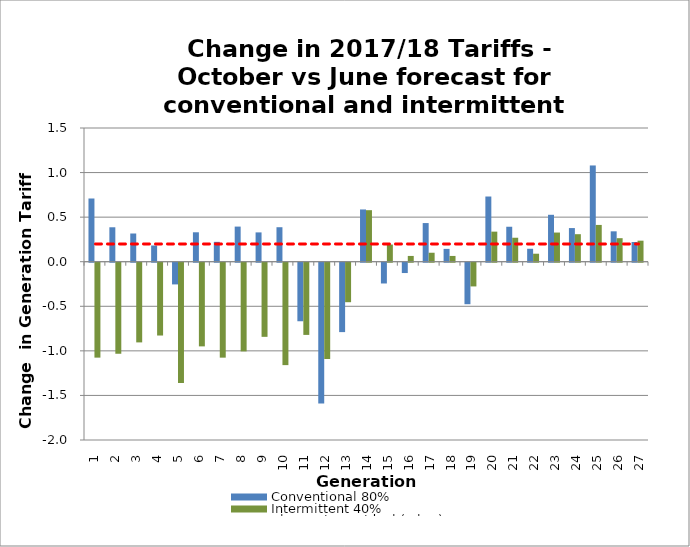
| Category | Conventional 80% | Intermittent 40% |
|---|---|---|
| 0 | 0.709 | -1.065 |
| 1 | 0.386 | -1.021 |
| 2 | 0.317 | -0.894 |
| 3 | 0.182 | -0.817 |
| 4 | -0.243 | -1.349 |
| 5 | 0.33 | -0.939 |
| 6 | 0.223 | -1.065 |
| 7 | 0.394 | -0.995 |
| 8 | 0.329 | -0.832 |
| 9 | 0.387 | -1.149 |
| 10 | -0.657 | -0.81 |
| 11 | -1.581 | -1.08 |
| 12 | -0.778 | -0.443 |
| 13 | 0.586 | 0.578 |
| 14 | -0.233 | 0.193 |
| 15 | -0.116 | 0.065 |
| 16 | 0.434 | 0.101 |
| 17 | 0.144 | 0.065 |
| 18 | -0.466 | -0.266 |
| 19 | 0.731 | 0.337 |
| 20 | 0.392 | 0.269 |
| 21 | 0.145 | 0.09 |
| 22 | 0.526 | 0.327 |
| 23 | 0.377 | 0.309 |
| 24 | 1.08 | 0.413 |
| 25 | 0.341 | 0.264 |
| 26 | 0.221 | 0.236 |